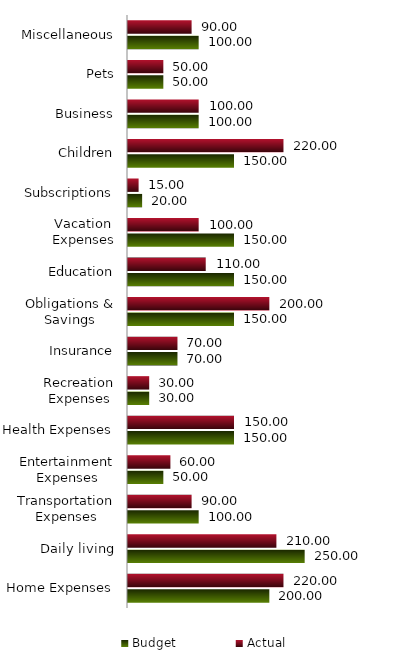
| Category | Budget | Actual |
|---|---|---|
| Home Expenses | 200 | 220 |
| Daily living | 250 | 210 |
| Transportation Expenses | 100 | 90 |
| Entertainment Expenses | 50 | 60 |
| Health Expenses | 150 | 150 |
| Recreation Expenses | 30 | 30 |
| Insurance | 70 | 70 |
| Obligations & Savings | 150 | 200 |
| Education | 150 | 110 |
| Vacation Expenses | 150 | 100 |
| Subscriptions | 20 | 15 |
| Children | 150 | 220 |
| Business | 100 | 100 |
| Pets | 50 | 50 |
| Miscellaneous | 100 | 90 |